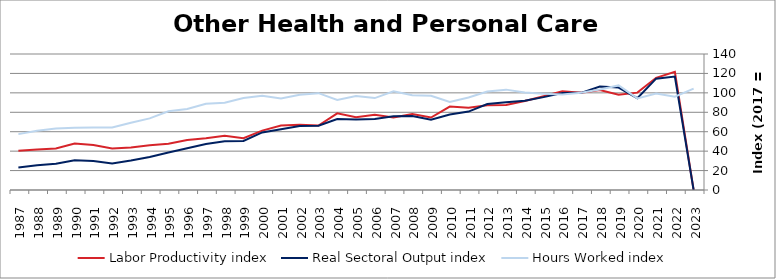
| Category | Labor Productivity index | Real Sectoral Output index | Hours Worked index |
|---|---|---|---|
| 2023.0 | 0 | 0 | 104.365 |
| 2022.0 | 121.561 | 116.829 | 96.108 |
| 2021.0 | 115.462 | 114.601 | 99.254 |
| 2020.0 | 100.213 | 94.495 | 94.293 |
| 2019.0 | 97.963 | 105.447 | 107.64 |
| 2018.0 | 102.927 | 106.582 | 103.551 |
| 2017.0 | 100 | 100 | 100 |
| 2016.0 | 101.666 | 99.898 | 98.261 |
| 2015.0 | 96.492 | 95.619 | 99.095 |
| 2014.0 | 91.615 | 91.928 | 100.342 |
| 2013.0 | 87.409 | 90.307 | 103.316 |
| 2012.0 | 87.284 | 88.502 | 101.395 |
| 2011.0 | 84.763 | 80.737 | 95.25 |
| 2010.0 | 85.842 | 77.79 | 90.621 |
| 2009.0 | 74.622 | 72.451 | 97.091 |
| 2008.0 | 78.127 | 76.224 | 97.564 |
| 2007.0 | 74.575 | 75.814 | 101.662 |
| 2006.0 | 77.366 | 73.209 | 94.627 |
| 2005.0 | 74.897 | 72.509 | 96.811 |
| 2004.0 | 78.91 | 73.145 | 92.693 |
| 2003.0 | 66.297 | 66.077 | 99.668 |
| 2002.0 | 67.13 | 65.778 | 97.985 |
| 2001.0 | 66.419 | 62.57 | 94.204 |
| 2000.0 | 61.13 | 59.28 | 96.973 |
| 1999.0 | 53.292 | 50.445 | 94.657 |
| 1998.0 | 55.728 | 50.078 | 89.862 |
| 1997.0 | 53.371 | 47.331 | 88.683 |
| 1996.0 | 51.502 | 42.897 | 83.292 |
| 1995.0 | 47.642 | 38.65 | 81.126 |
| 1994.0 | 46.151 | 34.009 | 73.691 |
| 1993.0 | 43.854 | 30.34 | 69.184 |
| 1992.0 | 42.638 | 27.395 | 64.251 |
| 1991.0 | 46.234 | 29.758 | 64.365 |
| 1990.0 | 47.907 | 30.719 | 64.122 |
| 1989.0 | 42.753 | 27.063 | 63.302 |
| 1988.0 | 41.666 | 25.383 | 60.919 |
| 1987.0 | 40.397 | 23.232 | 57.509 |